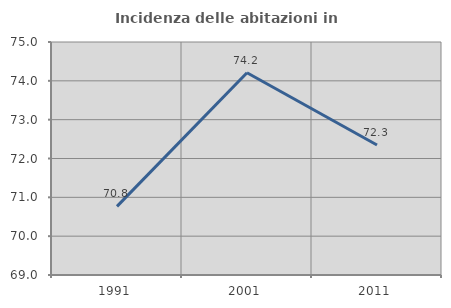
| Category | Incidenza delle abitazioni in proprietà  |
|---|---|
| 1991.0 | 70.767 |
| 2001.0 | 74.209 |
| 2011.0 | 72.347 |